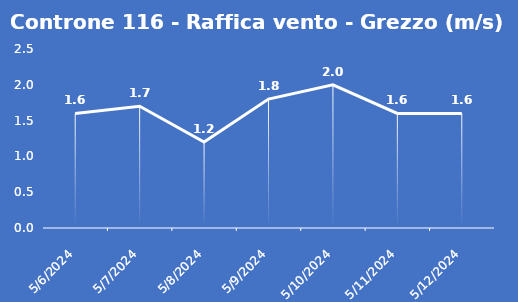
| Category | Controne 116 - Raffica vento - Grezzo (m/s) |
|---|---|
| 5/6/24 | 1.6 |
| 5/7/24 | 1.7 |
| 5/8/24 | 1.2 |
| 5/9/24 | 1.8 |
| 5/10/24 | 2 |
| 5/11/24 | 1.6 |
| 5/12/24 | 1.6 |